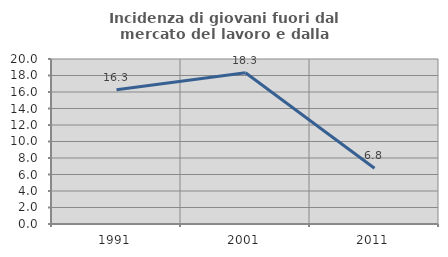
| Category | Incidenza di giovani fuori dal mercato del lavoro e dalla formazione  |
|---|---|
| 1991.0 | 16.262 |
| 2001.0 | 18.333 |
| 2011.0 | 6.751 |